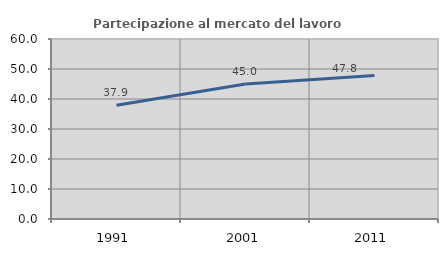
| Category | Partecipazione al mercato del lavoro  femminile |
|---|---|
| 1991.0 | 37.89 |
| 2001.0 | 45.033 |
| 2011.0 | 47.835 |